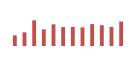
| Category | Importações (2) |
|---|---|
| 0 | 575.605 |
| 1 | 741.035 |
| 2 | 1388.881 |
| 3 | 899.436 |
| 4 | 1170.349 |
| 5 | 1022.737 |
| 6 | 1030.066 |
| 7 | 1010.02 |
| 8 | 1183.202 |
| 9 | 1121.55 |
| 10 | 1027.2 |
| 11 | 1322.762 |